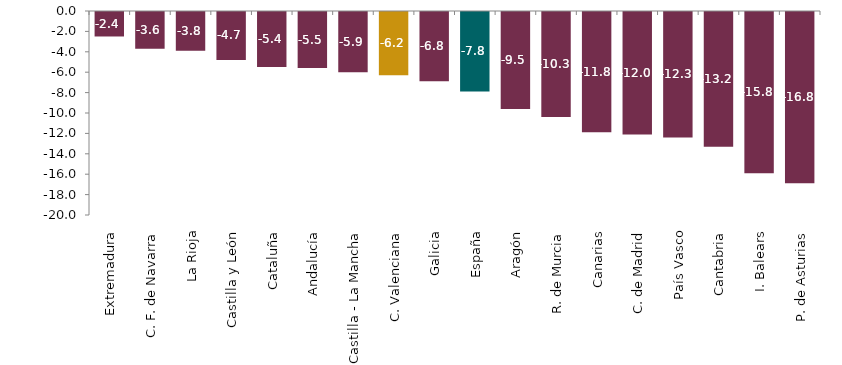
| Category | Series 0 |
|---|---|
| Extremadura | -2.4 |
| C. F. de Navarra | -3.6 |
| La Rioja | -3.8 |
| Castilla y León | -4.7 |
| Cataluña | -5.4 |
| Andalucía | -5.5 |
| Castilla - La Mancha | -5.9 |
| C. Valenciana | -6.2 |
| Galicia | -6.8 |
| España | -7.8 |
| Aragón | -9.5 |
| R. de Murcia | -10.3 |
| Canarias | -11.8 |
| C. de Madrid | -12 |
| País Vasco | -12.3 |
| Cantabria | -13.2 |
| I. Balears | -15.8 |
| P. de Asturias | -16.8 |